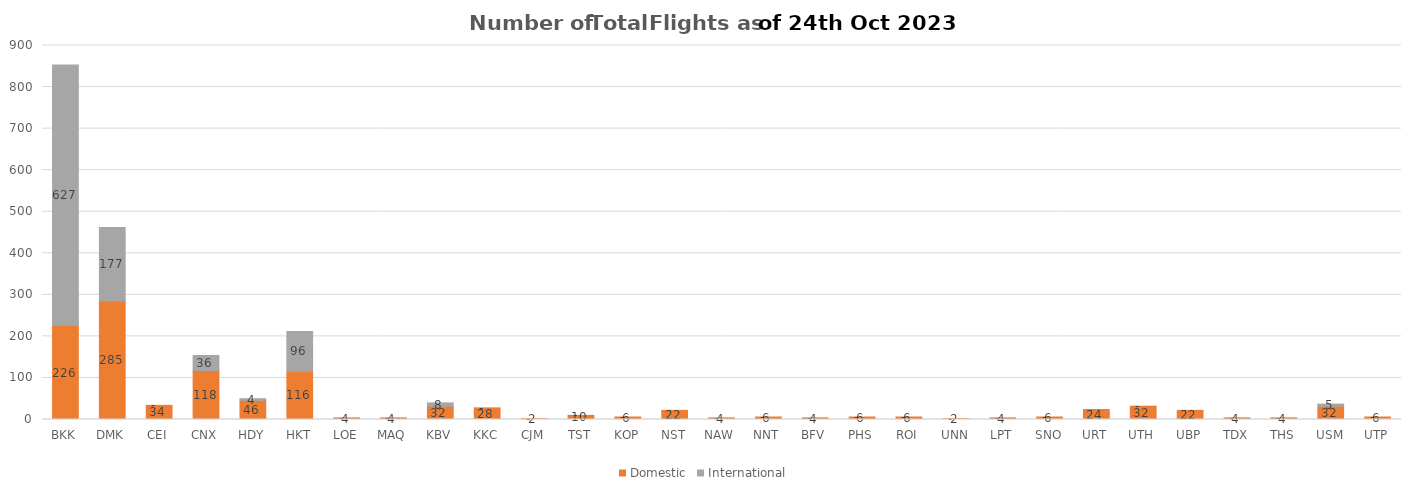
| Category | Domestic | International |
|---|---|---|
| BKK | 226 | 627 |
| DMK | 285 | 177 |
| CEI | 34 | 0 |
| CNX | 118 | 36 |
| HDY | 46 | 4 |
| HKT | 116 | 96 |
| LOE | 4 | 0 |
| MAQ | 4 | 0 |
| KBV | 32 | 8 |
| KKC | 28 | 0 |
| CJM | 2 | 0 |
| TST | 10 | 0 |
| KOP | 6 | 0 |
| NST | 22 | 0 |
| NAW | 4 | 0 |
| NNT | 6 | 0 |
| BFV | 4 | 0 |
| PHS | 6 | 0 |
| ROI | 6 | 0 |
| UNN | 2 | 0 |
| LPT | 4 | 0 |
| SNO | 6 | 0 |
| URT | 24 | 0 |
| UTH | 32 | 0 |
| UBP | 22 | 0 |
| TDX | 4 | 0 |
| THS | 4 | 0 |
| USM | 32 | 5 |
| UTP | 6 | 0 |